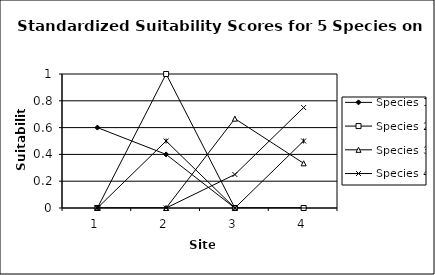
| Category | Species 1 | Species 2 | Species 3 | Species 4 | Species 5 |
|---|---|---|---|---|---|
| 0 | 0.6 | 0 | 0 | 0 | 0 |
| 1 | 0.4 | 1 | 0 | 0 | 0.5 |
| 2 | 0 | 0 | 0.667 | 0.25 | 0 |
| 3 | 0 | 0 | 0.333 | 0.75 | 0.5 |